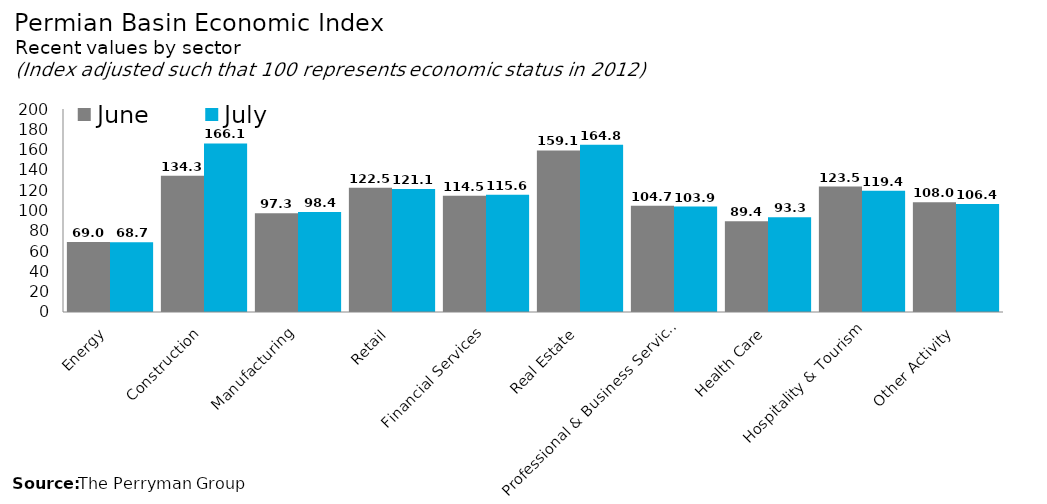
| Category | June | July |
|---|---|---|
| Energy | 68.989 | 68.725 |
| Construction | 134.325 | 166.132 |
| Manufacturing | 97.269 | 98.401 |
| Retail | 122.501 | 121.147 |
| Financial Services | 114.529 | 115.563 |
| Real Estate | 159.139 | 164.757 |
| Professional & Business Services | 104.657 | 103.925 |
| Health Care | 89.446 | 93.301 |
| Hospitality & Tourism | 123.531 | 119.413 |
| Other Activity | 108.039 | 106.42 |